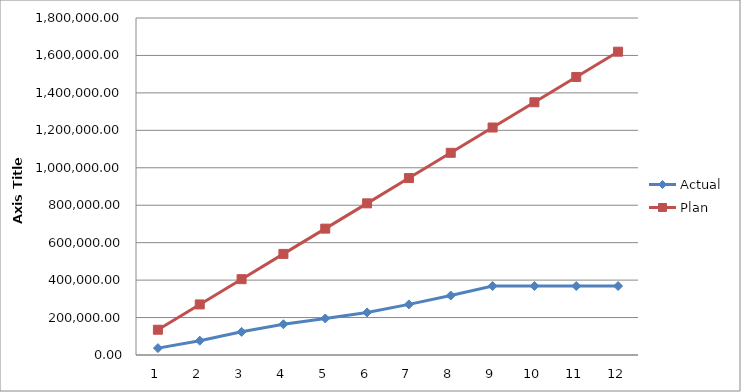
| Category | Actual | Plan |
|---|---|---|
| 0 | 36773.39 | 135000 |
| 1 | 76425.47 | 270000 |
| 2 | 123713.6 | 405000 |
| 3 | 164377.43 | 540000 |
| 4 | 195164.45 | 675000 |
| 5 | 227316.09 | 810000 |
| 6 | 270286.36 | 945000 |
| 7 | 317733.18 | 1080000 |
| 8 | 368324.94 | 1215000 |
| 9 | 368324.94 | 1350000 |
| 10 | 368324.94 | 1485000 |
| 11 | 368324.94 | 1620000 |